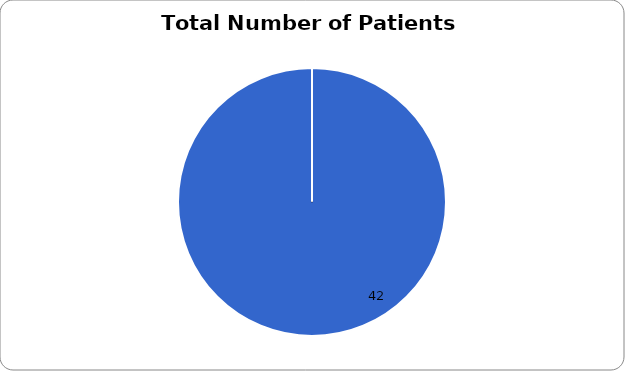
| Category | Series 0 |
|---|---|
| 0 | 42 |